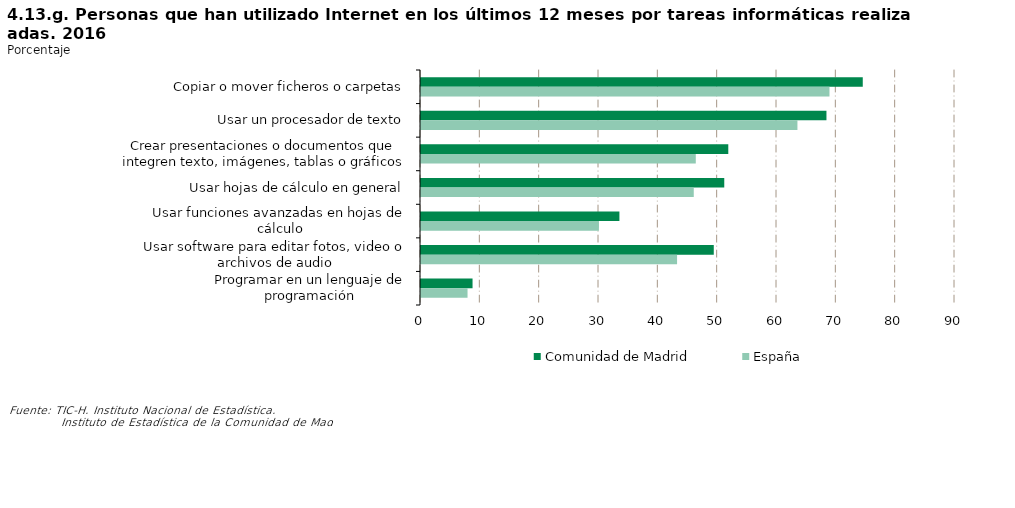
| Category | Comunidad de Madrid | España |
|---|---|---|
| Copiar o mover ficheros o carpetas | 74.454 | 68.847 |
| Usar un procesador de texto | 68.334 | 63.444 |
| Crear presentaciones o documentos que integren texto, imágenes, tablas o gráficos | 51.79 | 46.311 |
| Usar hojas de cálculo en general | 51.111 | 45.97 |
| Usar funciones avanzadas en hojas de cálculo | 33.44 | 29.987 |
| Usar software para editar fotos, video o archivos de audio | 49.343 | 43.157 |
| Programar en un lenguaje de programación | 8.687 | 7.844 |